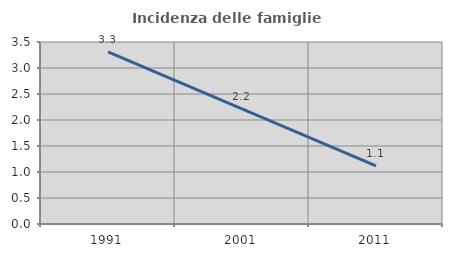
| Category | Incidenza delle famiglie numerose |
|---|---|
| 1991.0 | 3.308 |
| 2001.0 | 2.213 |
| 2011.0 | 1.12 |